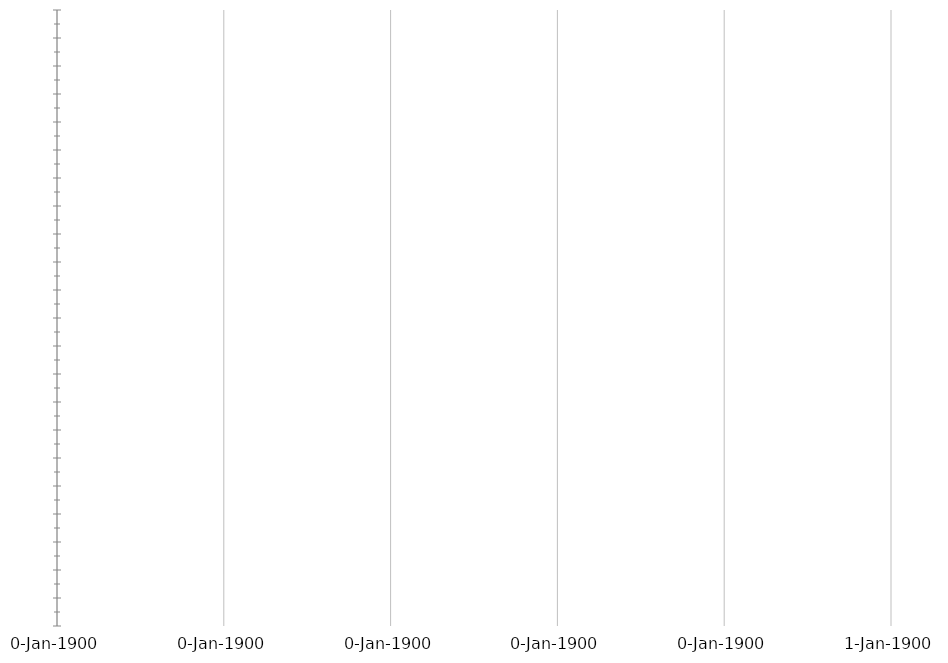
| Category | START | DAUER |
|---|---|---|
|  |  | 0 |
|  |  | 0 |
|  |  | 0 |
|  |  | 0 |
|  |  | 0 |
|  |  | 0 |
|  |  | 0 |
|  |  | 0 |
|  |  | 0 |
|  |  | 0 |
|  |  | 0 |
|  |  | 0 |
|  |  | 0 |
|  |  | 0 |
|  |  | 0 |
|  |  | 0 |
|  |  | 0 |
|  |  | 0 |
|  |  | 0 |
|  |  | 0 |
|  |  | 0 |
|  |  | 0 |